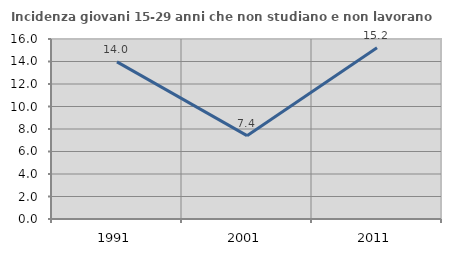
| Category | Incidenza giovani 15-29 anni che non studiano e non lavorano  |
|---|---|
| 1991.0 | 13.971 |
| 2001.0 | 7.407 |
| 2011.0 | 15.217 |